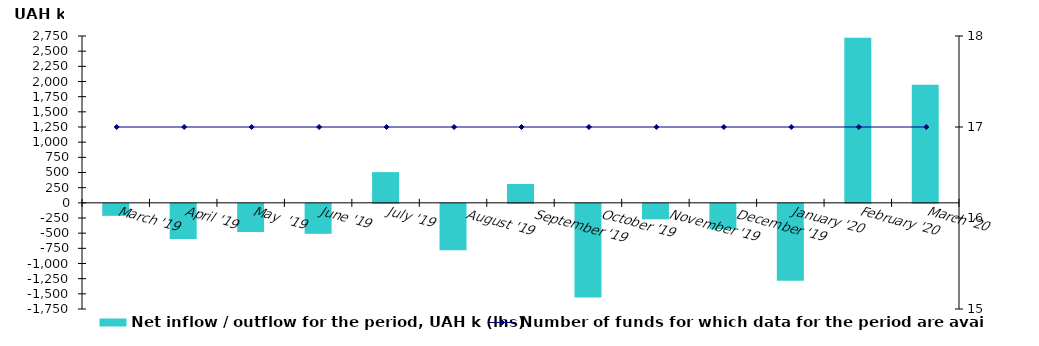
| Category | Net inflow / outflow for the period, UAH k (lhs) |
|---|---|
| March '19 | -198.106 |
| April '19 | -579.042 |
| May  '19 | -464.305 |
| June '19 | -494.039 |
| July '19 | 506.355 |
|    August '19 | -766.569 |
|    September '19 | 311.168 |
|    October '19 | -1545.724 |
|    November '19 | -255.903 |
|    December '19 | -415.371 |
| January '20 | -1268.023 |
| February '20 | 2721.965 |
| March '20 | 1946.081 |